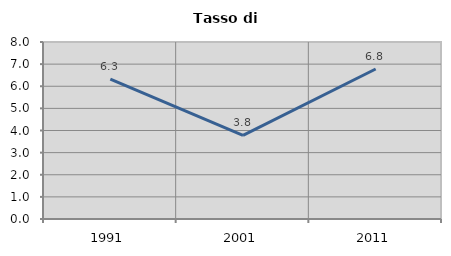
| Category | Tasso di disoccupazione   |
|---|---|
| 1991.0 | 6.319 |
| 2001.0 | 3.781 |
| 2011.0 | 6.78 |